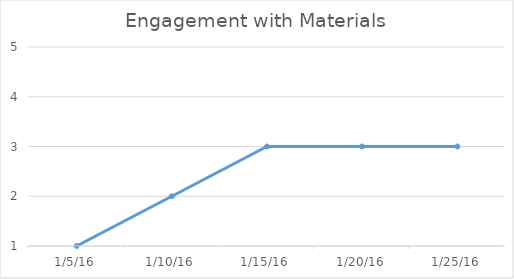
| Category | Series 0 |
|---|---|
| 1/5/16 | 1 |
| 1/10/16 | 2 |
| 1/15/16 | 3 |
| 1/20/16 | 3 |
| 1/25/16 | 3 |